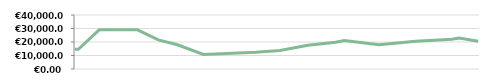
| Category | KUUKAUSI   |
|---|---|
| 2013-04-23 | 14600 |
| 2013-04-25 | 14600 |
| 2013-05-07 | 29000 |
| 2013-05-14 | 29000 |
| 2013-05-14 | 29000 |
| 2013-05-29 | 29000 |
| 2013-06-10 | 21600 |
| 2013-06-21 | 17950 |
| 2013-07-06 | 10776.471 |
| 2013-08-05 | 12455.862 |
| 2013-08-19 | 13667.568 |
| 2013-09-04 | 17651.667 |
| 2013-09-20 | 19877.912 |
| 2013-09-25 | 21138.05 |
| 2013-10-15 | 17951.744 |
| 2013-11-05 | 20556.13 |
| 2013-11-26 | 21997.139 |
| 2013-11-30 | 22917.635 |
| 2013-12-11 | 20504.315 |